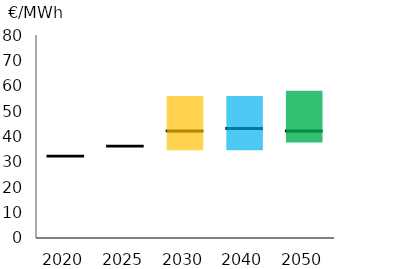
| Category | Series 1 | Series 2 | Series 3 | Series 4 |
|---|---|---|---|---|
| 2020.0 | 0 | 32 | 0.1 | -32.1 |
| 2025.0 | 0 | 36 | 0.1 | -36.1 |
| 2030.0 | 35 | 7 | 0.1 | 13.9 |
| 2040.0 | 35 | 8 | 0.1 | 12.9 |
| 2050.0 | 38 | 4 | 0.1 | 15.9 |